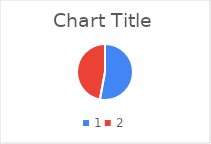
| Category | Series 0 |
|---|---|
| 0 | 18 |
| 1 | 16 |